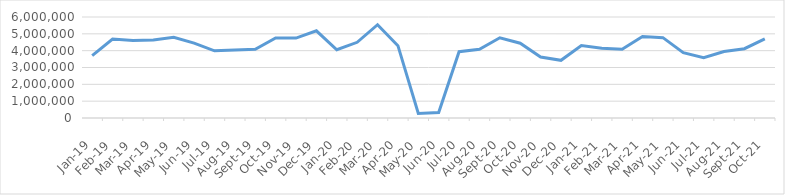
| Category | Series 0 |
|---|---|
| 2019-01-01 | 3709307.148 |
| 2019-02-01 | 4693653.747 |
| 2019-03-01 | 4603287.27 |
| 2019-04-01 | 4629213.278 |
| 2019-05-01 | 4798394.226 |
| 2019-06-01 | 4446716.34 |
| 2019-07-01 | 3991541.964 |
| 2019-08-01 | 4041463.023 |
| 2019-09-01 | 4082275.51 |
| 2019-10-01 | 4753679.156 |
| 2019-11-01 | 4748995.209 |
| 2019-12-01 | 5179278.353 |
| 2020-01-01 | 4054346.96 |
| 2020-02-01 | 4497030.318 |
| 2020-03-01 | 5541755.628 |
| 2020-04-01 | 4295936.894 |
| 2020-05-01 | 265333.02 |
| 2020-06-01 | 328188.3 |
| 2020-07-01 | 3938963.159 |
| 2020-08-01 | 4078958.761 |
| 2020-09-01 | 4768216.782 |
| 2020-10-01 | 4442637.326 |
| 2020-11-01 | 3624025.336 |
| 2020-12-01 | 3426311.01 |
| 2021-01-01 | 4309821.1 |
| 2021-02-01 | 4144363.93 |
| 2021-03-01 | 4084074.98 |
| 2021-04-01 | 4838057.47 |
| 2021-05-01 | 4772421.31 |
| 2021-06-01 | 3883623.391 |
| 2021-07-01 | 3585965.936 |
| 2021-08-01 | 3949847.83 |
| 2021-09-01 | 4115810.94 |
| 2021-10-01 | 4702288.23 |